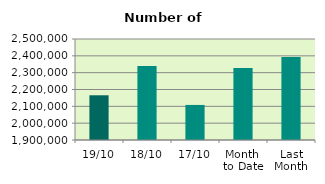
| Category | Series 0 |
|---|---|
| 19/10 | 2165672 |
| 18/10 | 2339540 |
| 17/10 | 2108278 |
| Month 
to Date | 2327144.923 |
| Last
Month | 2392468.182 |